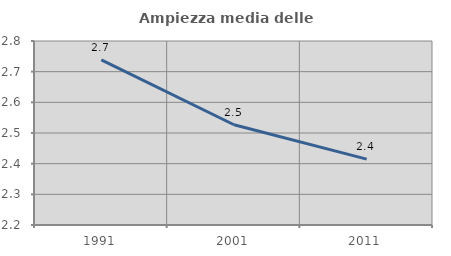
| Category | Ampiezza media delle famiglie |
|---|---|
| 1991.0 | 2.739 |
| 2001.0 | 2.527 |
| 2011.0 | 2.415 |